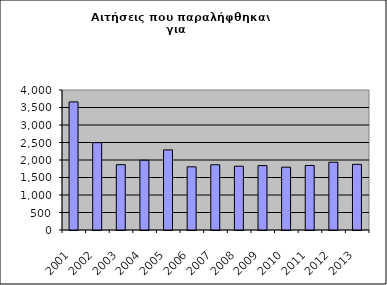
| Category | Series 1 |
|---|---|
| 2001.0 | 3659 |
| 2002.0 | 2495 |
| 2003.0 | 1867 |
| 2004.0 | 1993 |
| 2005.0 | 2289 |
| 2006.0 | 1805 |
| 2007.0 | 1864 |
| 2008.0 | 1822 |
| 2009.0 | 1840 |
| 2010.0 | 1795 |
| 2011.0 | 1844 |
| 2012.0 | 1936 |
| 2013.0 | 1876 |